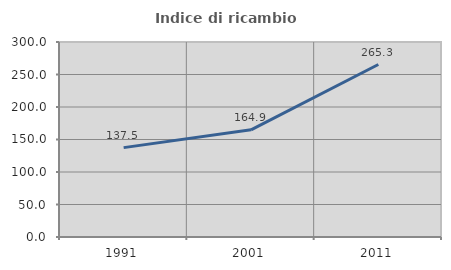
| Category | Indice di ricambio occupazionale  |
|---|---|
| 1991.0 | 137.5 |
| 2001.0 | 164.865 |
| 2011.0 | 265.333 |